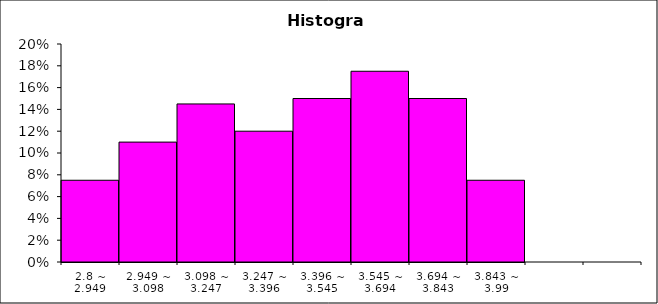
| Category | Freq |
|---|---|
| 2.8 ~ 2.949 | 0.075 |
| 2.949 ~ 3.098 | 0.11 |
| 3.098 ~ 3.247 | 0.145 |
| 3.247 ~ 3.396 | 0.12 |
| 3.396 ~ 3.545 | 0.15 |
| 3.545 ~ 3.694 | 0.175 |
| 3.694 ~ 3.843 | 0.15 |
| 3.843 ~ 3.99 | 0.075 |